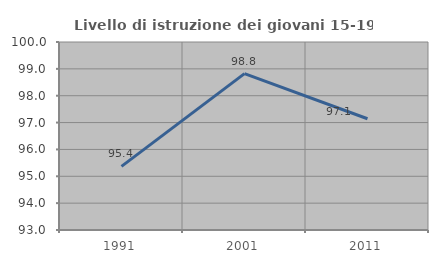
| Category | Livello di istruzione dei giovani 15-19 anni |
|---|---|
| 1991.0 | 95.37 |
| 2001.0 | 98.824 |
| 2011.0 | 97.143 |